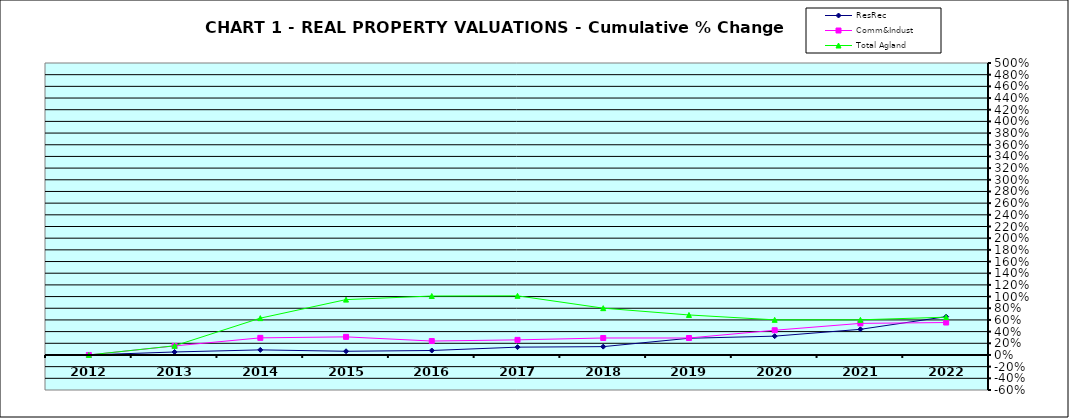
| Category | ResRec | Comm&Indust | Total Agland |
|---|---|---|---|
| 2012.0 | 0 | 0 | 0 |
| 2013.0 | 0.051 | 0.155 | 0.157 |
| 2014.0 | 0.087 | 0.293 | 0.631 |
| 2015.0 | 0.063 | 0.31 | 0.948 |
| 2016.0 | 0.077 | 0.238 | 1.01 |
| 2017.0 | 0.134 | 0.259 | 1.013 |
| 2018.0 | 0.143 | 0.291 | 0.802 |
| 2019.0 | 0.286 | 0.29 | 0.685 |
| 2020.0 | 0.322 | 0.423 | 0.602 |
| 2021.0 | 0.439 | 0.541 | 0.602 |
| 2022.0 | 0.656 | 0.556 | 0.647 |